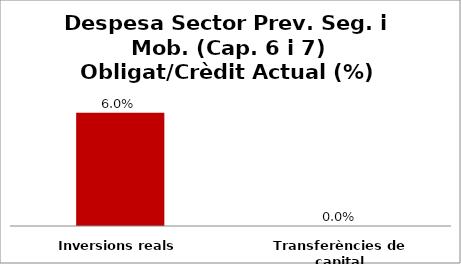
| Category | Series 0 |
|---|---|
| Inversions reals | 0.06 |
| Transferències de capital | 0 |